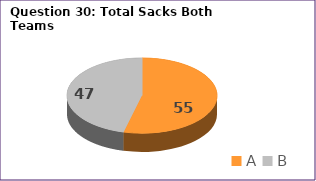
| Category | Series 0 |
|---|---|
| A | 55 |
| B | 47 |